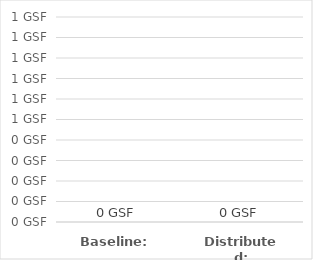
| Category | Summary |
|---|---|
| Baseline: | 0 |
| Distributed: | 0 |